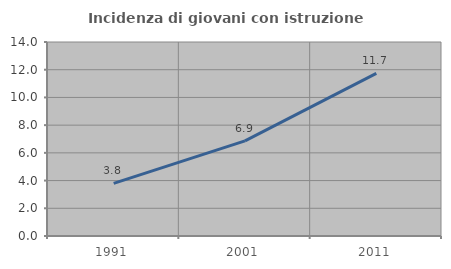
| Category | Incidenza di giovani con istruzione universitaria |
|---|---|
| 1991.0 | 3.801 |
| 2001.0 | 6.861 |
| 2011.0 | 11.742 |